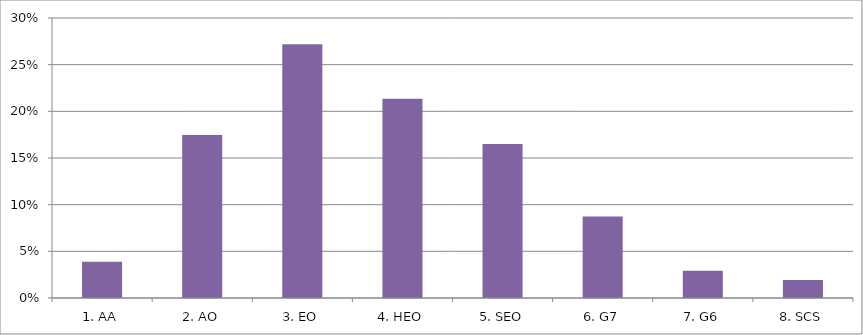
| Category | Bullying, Harrasment, Discrimination |
|---|---|
| 1. AA | 0.039 |
| 2. AO | 0.175 |
| 3. EO | 0.272 |
| 4. HEO | 0.214 |
| 5. SEO | 0.165 |
| 6. G7 | 0.087 |
| 7. G6 | 0.029 |
| 8. SCS | 0.019 |